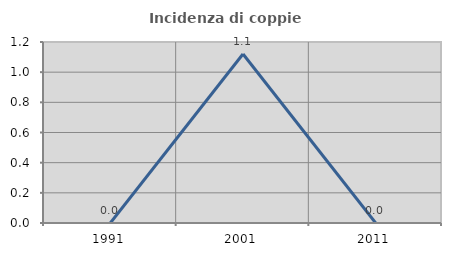
| Category | Incidenza di coppie miste |
|---|---|
| 1991.0 | 0 |
| 2001.0 | 1.12 |
| 2011.0 | 0 |